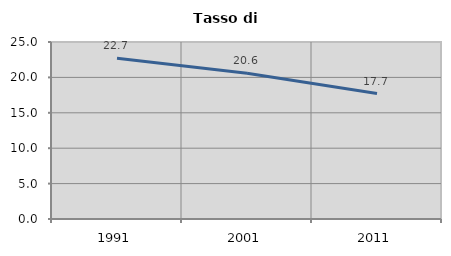
| Category | Tasso di disoccupazione   |
|---|---|
| 1991.0 | 22.689 |
| 2001.0 | 20.594 |
| 2011.0 | 17.716 |